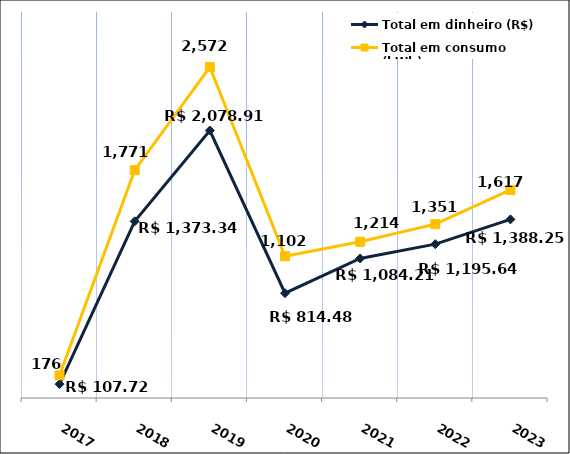
| Category | Total em dinheiro (R$) |
|---|---|
| 2017.0 | 107.72 |
| 2018.0 | 1373.34 |
| 2019.0 | 2078.91 |
| 2020.0 | 814.48 |
| 2021.0 | 1084.21 |
| 2022.0 | 1195.64 |
| 2023.0 | 1388.25 |